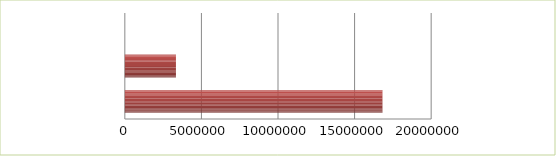
| Category | Series 0 | Series 1 |
|---|---|---|
| 0 | 2.5 | 16820336 |
| 1 | 2.6 | 3336966 |
| 2 | 2.7 | 0 |